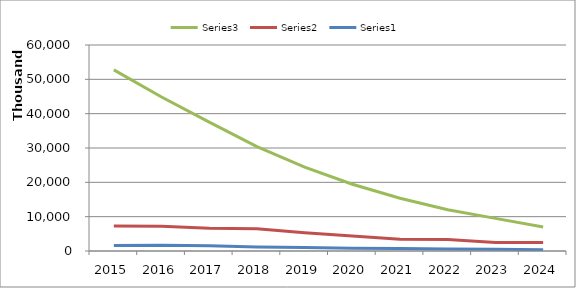
| Category | Series 2 | Series 1 | Series 0 |
|---|---|---|---|
| 2015.0 | 52748988 | 7257181 | 1584150 |
| 2016.0 | 44864903 | 7229323 | 1700000 |
| 2017.0 | 37552865 | 6657276 | 1500000 |
| 2018.0 | 30407174 | 6490929 | 1200000 |
| 2019.0 | 24444136 | 5308276 | 1000000 |
| 2020.0 | 19454762 | 4334612 | 800000 |
| 2021.0 | 15350000 | 3450000 | 700000 |
| 2022.0 | 12000000 | 3350000 | 600000 |
| 2023.0 | 9500000 | 2500000 | 500000 |
| 2024.0 | 7000000 | 2500000 | 400000 |